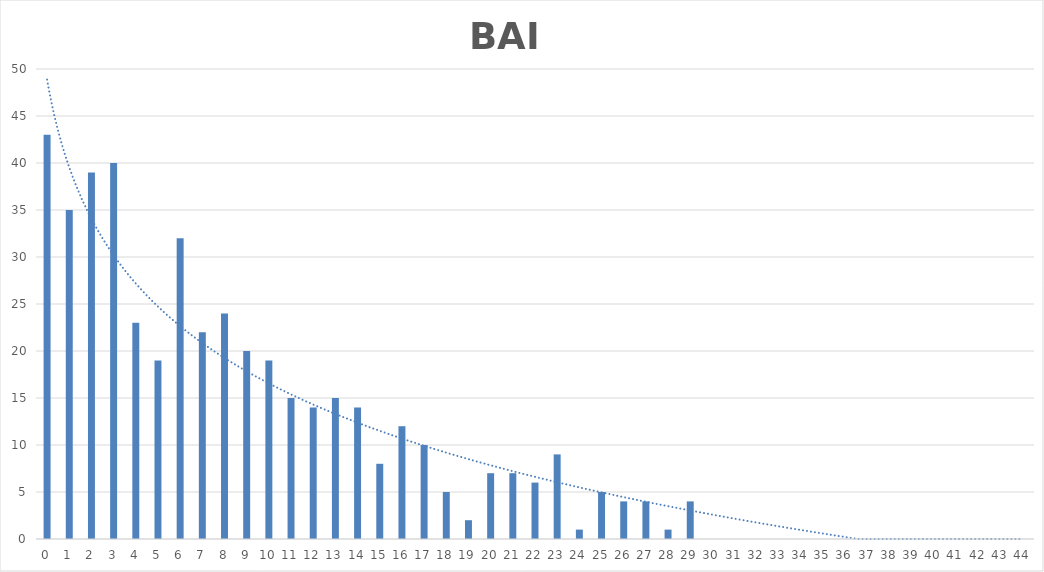
| Category | Series 0 |
|---|---|
| 0.0 | 43 |
| 1.0 | 35 |
| 2.0 | 39 |
| 3.0 | 40 |
| 4.0 | 23 |
| 5.0 | 19 |
| 6.0 | 32 |
| 7.0 | 22 |
| 8.0 | 24 |
| 9.0 | 20 |
| 10.0 | 19 |
| 11.0 | 15 |
| 12.0 | 14 |
| 13.0 | 15 |
| 14.0 | 14 |
| 15.0 | 8 |
| 16.0 | 12 |
| 17.0 | 10 |
| 18.0 | 5 |
| 19.0 | 2 |
| 20.0 | 7 |
| 21.0 | 7 |
| 22.0 | 6 |
| 23.0 | 9 |
| 24.0 | 1 |
| 25.0 | 5 |
| 26.0 | 4 |
| 27.0 | 4 |
| 28.0 | 1 |
| 29.0 | 4 |
| 30.0 | 0 |
| 31.0 | 0 |
| 32.0 | 0 |
| 33.0 | 0 |
| 34.0 | 0 |
| 35.0 | 0 |
| 36.0 | 0 |
| 37.0 | 0 |
| 38.0 | 0 |
| 39.0 | 0 |
| 40.0 | 0 |
| 41.0 | 0 |
| 42.0 | 0 |
| 43.0 | 0 |
| 44.0 | 0 |